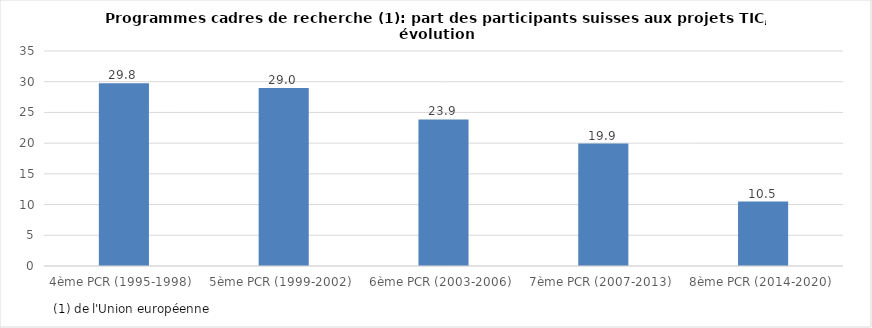
| Category | Series 0 |
|---|---|
| 4ème PCR (1995-1998)  | 29.759 |
| 5ème PCR (1999-2002)  | 28.988 |
| 6ème PCR (2003-2006)  | 23.852 |
| 7ème PCR (2007-2013)  | 19.94 |
| 8ème PCR (2014-2020)  | 10.484 |